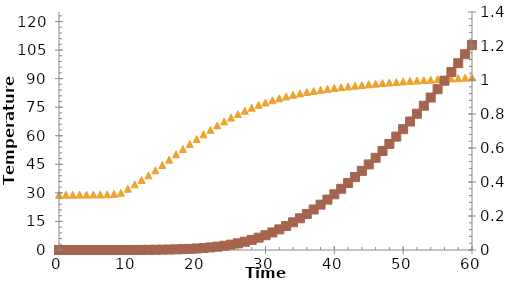
| Category | Series 0 |
|---|---|
| 0.0 | 29.05 |
| 1.0 | 29.05 |
| 2.0 | 29.05 |
| 3.0 | 29.1 |
| 4.0 | 29.1 |
| 5.0 | 29.15 |
| 6.0 | 29.2 |
| 7.0 | 29.25 |
| 8.0 | 29.45 |
| 9.0 | 30.05 |
| 10.0 | 32.2 |
| 11.0 | 34.5 |
| 12.0 | 36.8 |
| 13.0 | 39.2 |
| 14.0 | 41.85 |
| 15.0 | 44.65 |
| 16.0 | 47.45 |
| 17.0 | 50.25 |
| 18.0 | 53 |
| 19.0 | 55.7 |
| 20.0 | 58.3 |
| 21.0 | 60.75 |
| 22.0 | 63.1 |
| 23.0 | 65.45 |
| 24.0 | 67.55 |
| 25.0 | 69.55 |
| 26.0 | 71.4 |
| 27.0 | 73.15 |
| 28.0 | 74.75 |
| 29.0 | 76.2 |
| 30.0 | 77.5 |
| 31.0 | 78.65 |
| 32.0 | 79.7 |
| 33.0 | 80.65 |
| 34.0 | 81.55 |
| 35.0 | 82.25 |
| 36.0 | 82.95 |
| 37.0 | 83.55 |
| 38.0 | 84.1 |
| 39.0 | 84.6 |
| 40.0 | 85.1 |
| 41.0 | 85.5 |
| 42.0 | 85.9 |
| 43.0 | 86.3 |
| 44.0 | 86.65 |
| 45.0 | 87.05 |
| 46.0 | 87.35 |
| 47.0 | 87.7 |
| 48.0 | 88 |
| 49.0 | 88.25 |
| 50.0 | 88.55 |
| 51.0 | 88.8 |
| 52.0 | 89 |
| 53.0 | 89.25 |
| 54.0 | 89.45 |
| 55.0 | 89.7 |
| 56.0 | 89.85 |
| 57.0 | 90.1 |
| 58.0 | 90.25 |
| 59.0 | 90.5 |
| 60.0 | 90.65 |
| 61.0 | 90.85 |